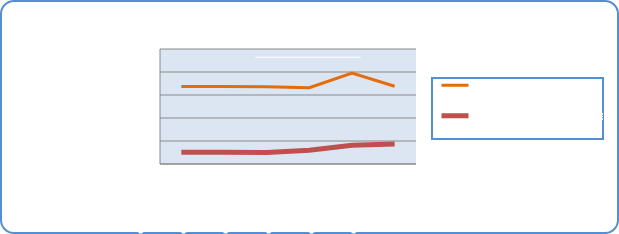
| Category | Motorin Türleri litre | Benzin Türleri litre |
|---|---|---|
| 8/5/19 | 67313863.026 | 10171675.505 |
| 8/6/19 | 67473108.775 | 10133981.29 |
| 8/7/19 | 67098700.761 | 9986222.594 |
| 8/8/19 | 66344650.988 | 12041848.005 |
| 8/9/19 | 78989843.467 | 16375053.543 |
| 8/10/19 | 67620209.831 | 17443860.875 |